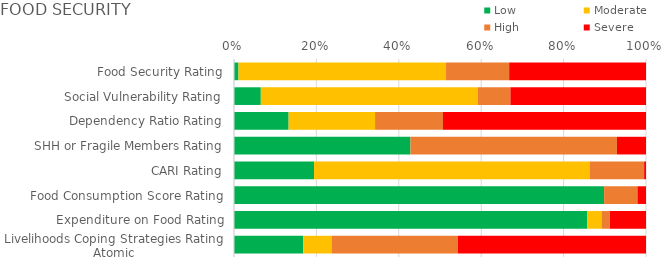
| Category | Low | Moderate | High | Severe |
|---|---|---|---|---|
| Food Security Rating | 0.011 | 0.504 | 0.153 | 0.332 |
| Social Vulnerability Rating | 0.065 | 0.527 | 0.079 | 0.329 |
| Dependency Ratio Rating | 0.133 | 0.21 | 0.165 | 0.493 |
| SHH or Fragile Members Rating | 0.428 | 0 | 0.501 | 0.07 |
| CARI Rating | 0.194 | 0.669 | 0.132 | 0.005 |
| Food Consumption Score Rating | 0.898 | 0 | 0.081 | 0.021 |
| Expenditure on Food Rating | 0.858 | 0.034 | 0.02 | 0.088 |
| Livelihoods Coping Strategies Rating Atomic | 0.168 | 0.069 | 0.306 | 0.457 |